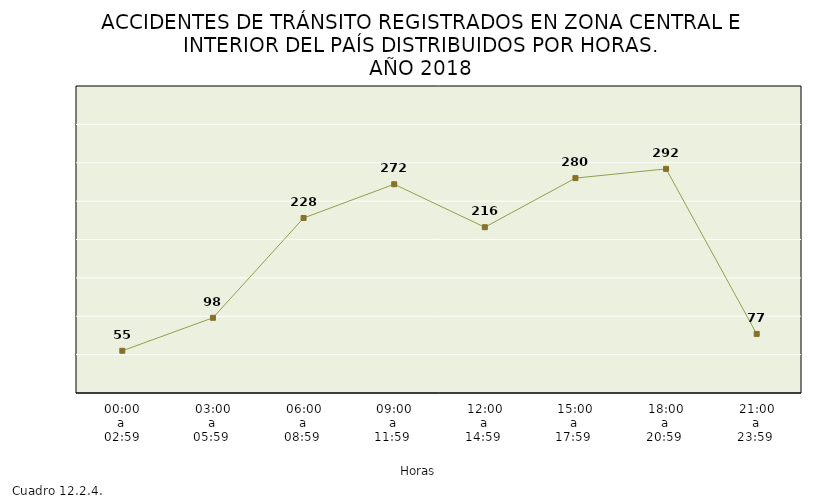
| Category | Total |
|---|---|
| 00:00
a
02:59 | 55 |
| 03:00
a
05:59  | 98 |
| 06:00
a
08:59  | 228 |
| 09:00
a
11:59  | 272 |
| 12:00
a
14:59  | 216 |
| 15:00
a
17:59  | 280 |
| 18:00
a
20:59  | 292 |
| 21:00
a
23:59  | 77 |